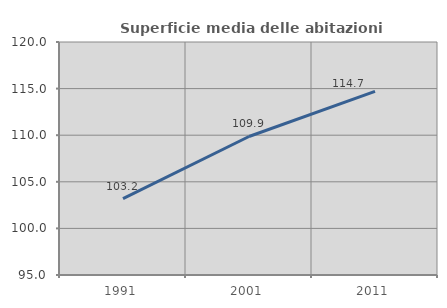
| Category | Superficie media delle abitazioni occupate |
|---|---|
| 1991.0 | 103.187 |
| 2001.0 | 109.862 |
| 2011.0 | 114.706 |